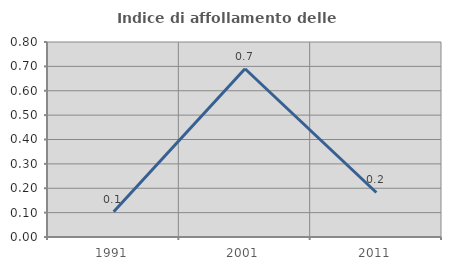
| Category | Indice di affollamento delle abitazioni  |
|---|---|
| 1991.0 | 0.104 |
| 2001.0 | 0.69 |
| 2011.0 | 0.183 |